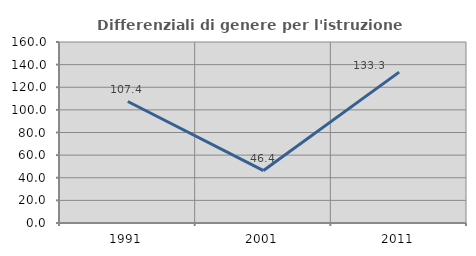
| Category | Differenziali di genere per l'istruzione superiore |
|---|---|
| 1991.0 | 107.383 |
| 2001.0 | 46.371 |
| 2011.0 | 133.346 |